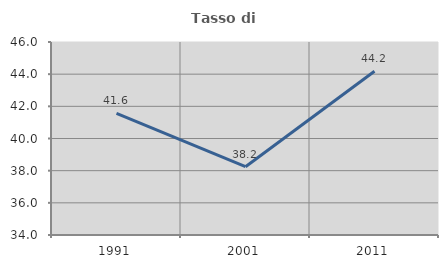
| Category | Tasso di occupazione   |
|---|---|
| 1991.0 | 41.558 |
| 2001.0 | 38.246 |
| 2011.0 | 44.186 |